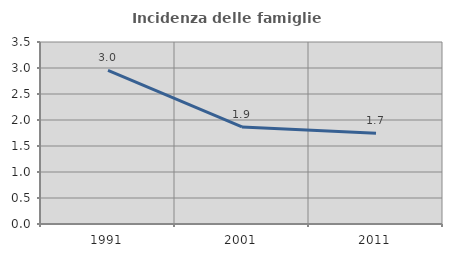
| Category | Incidenza delle famiglie numerose |
|---|---|
| 1991.0 | 2.954 |
| 2001.0 | 1.866 |
| 2011.0 | 1.746 |